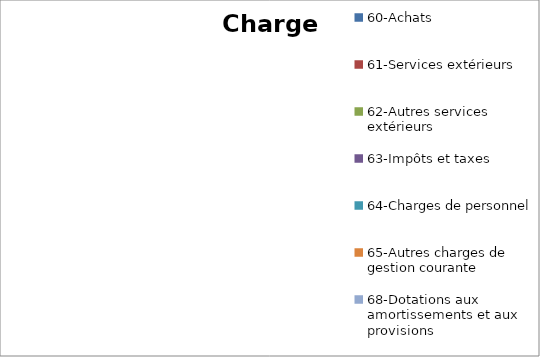
| Category | Series 0 |
|---|---|
| 60-Achats | 0 |
| 61-Services extérieurs | 0 |
| 62-Autres services extérieurs | 0 |
| 63-Impôts et taxes  | 0 |
| 64-Charges de personnel | 0 |
| 65-Autres charges de gestion courante | 0 |
| 68-Dotations aux amortissements et aux provisions | 0 |